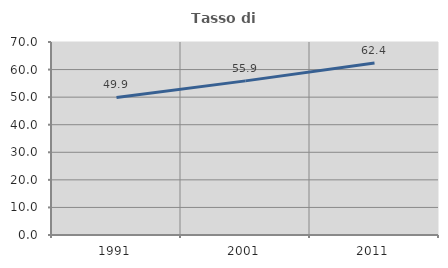
| Category | Tasso di occupazione   |
|---|---|
| 1991.0 | 49.881 |
| 2001.0 | 55.902 |
| 2011.0 | 62.406 |